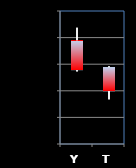
| Category | Series 0 | Series 1 | Series 2 | Series 3 |
|---|---|---|---|---|
| Y | 1.339 | 1.344 | 1.327 | 1.328 |
| T | 1.329 | 1.329 | 1.317 | 1.32 |